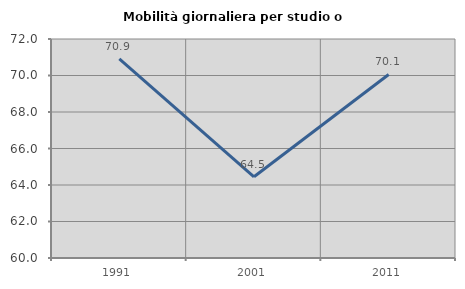
| Category | Mobilità giornaliera per studio o lavoro |
|---|---|
| 1991.0 | 70.909 |
| 2001.0 | 64.45 |
| 2011.0 | 70.055 |